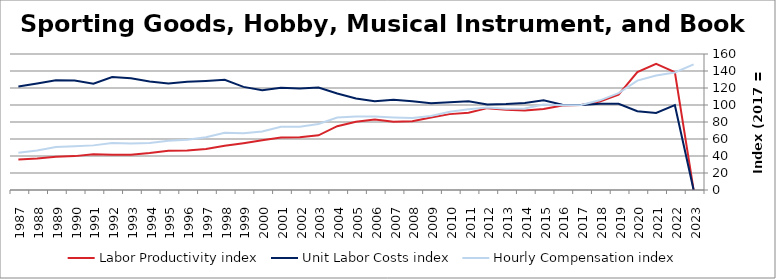
| Category | Labor Productivity index | Unit Labor Costs index | Hourly Compensation index |
|---|---|---|---|
| 2023.0 | 0 | 0 | 147.803 |
| 2022.0 | 138.622 | 99.786 | 138.326 |
| 2021.0 | 148.481 | 90.654 | 134.604 |
| 2020.0 | 138.775 | 92.732 | 128.689 |
| 2019.0 | 112.309 | 101.445 | 113.931 |
| 2018.0 | 103.984 | 101.448 | 105.49 |
| 2017.0 | 100 | 100 | 100 |
| 2016.0 | 99.359 | 100.243 | 99.601 |
| 2015.0 | 95.408 | 105.462 | 100.62 |
| 2014.0 | 93.434 | 102.495 | 95.765 |
| 2013.0 | 94.481 | 101.206 | 95.621 |
| 2012.0 | 96.306 | 100.678 | 96.96 |
| 2011.0 | 90.968 | 104.399 | 94.97 |
| 2010.0 | 89.268 | 103.248 | 92.167 |
| 2009.0 | 85.303 | 102.013 | 87.02 |
| 2008.0 | 81.015 | 104.484 | 84.648 |
| 2007.0 | 80.374 | 106.131 | 85.303 |
| 2006.0 | 82.898 | 104.279 | 86.445 |
| 2005.0 | 80.2 | 107.681 | 86.361 |
| 2004.0 | 75.042 | 113.58 | 85.233 |
| 2003.0 | 64.33 | 120.66 | 77.62 |
| 2002.0 | 62.189 | 119.501 | 74.317 |
| 2001.0 | 61.815 | 120.272 | 74.346 |
| 2000.0 | 58.531 | 117.494 | 68.77 |
| 1999.0 | 55.025 | 121.297 | 66.744 |
| 1998.0 | 51.926 | 129.706 | 67.352 |
| 1997.0 | 48.32 | 128.306 | 61.998 |
| 1996.0 | 46.519 | 127.312 | 59.224 |
| 1995.0 | 46.134 | 125.333 | 57.821 |
| 1994.0 | 43.416 | 127.542 | 55.374 |
| 1993.0 | 41.553 | 131.391 | 54.597 |
| 1992.0 | 41.58 | 132.923 | 55.269 |
| 1991.0 | 41.961 | 125.119 | 52.501 |
| 1990.0 | 39.854 | 128.896 | 51.37 |
| 1989.0 | 39.087 | 129.1 | 50.461 |
| 1988.0 | 37.166 | 125.195 | 46.529 |
| 1987.0 | 35.956 | 121.769 | 43.783 |